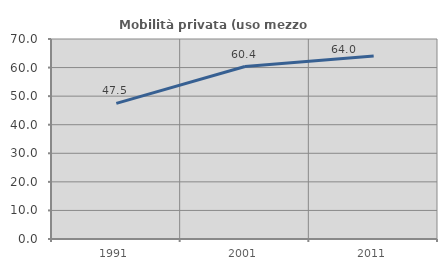
| Category | Mobilità privata (uso mezzo privato) |
|---|---|
| 1991.0 | 47.472 |
| 2001.0 | 60.357 |
| 2011.0 | 64.023 |